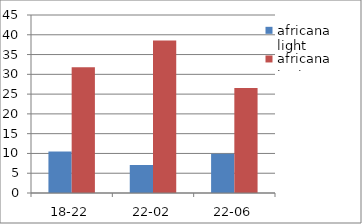
| Category | africana light | africana tent |
|---|---|---|
| 18-22 | 10.489 | 31.819 |
| 22-02 | 7.072 | 38.562 |
| 22-06 | 9.917 | 26.533 |